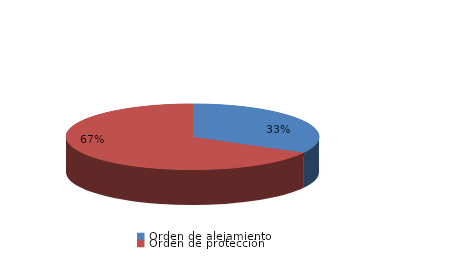
| Category | Series 0 |
|---|---|
| Orden de alejamiento | 184 |
| Orden de protección | 373 |